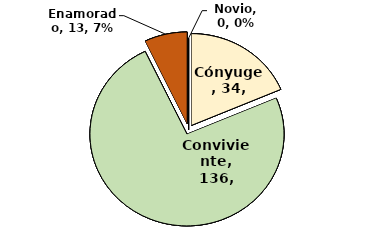
| Category | Series 0 |
|---|---|
| Cónyuge | 34 |
| Conviviente | 136 |
| Enamorado | 13 |
| Novio | 0 |